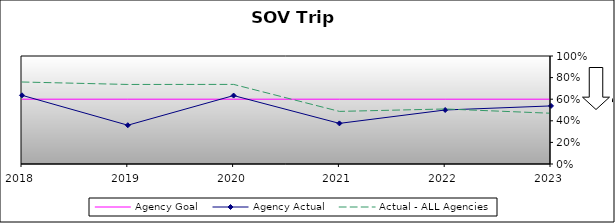
| Category | Agency Goal | Agency Actual | Actual - ALL Agencies |
|---|---|---|---|
| 2018.0 | 0.6 | 0.636 | 0.759 |
| 2019.0 | 0.6 | 0.359 | 0.736 |
| 2020.0 | 0.6 | 0.634 | 0.737 |
| 2021.0 | 0.6 | 0.376 | 0.487 |
| 2022.0 | 0.6 | 0.5 | 0.509 |
| 2023.0 | 0.6 | 0.538 | 0.47 |